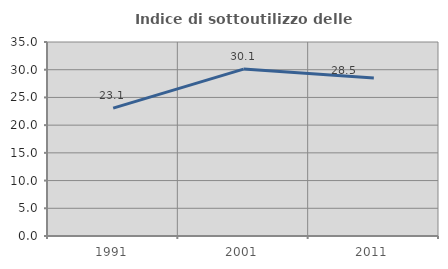
| Category | Indice di sottoutilizzo delle abitazioni  |
|---|---|
| 1991.0 | 23.075 |
| 2001.0 | 30.112 |
| 2011.0 | 28.511 |